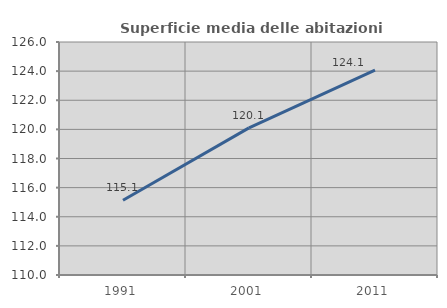
| Category | Superficie media delle abitazioni occupate |
|---|---|
| 1991.0 | 115.136 |
| 2001.0 | 120.105 |
| 2011.0 | 124.074 |